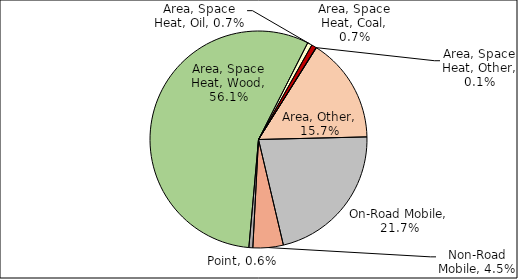
| Category | Series 0 |
|---|---|
| Point | 0.006 |
| Area, Space Heat, Wood | 0.561 |
| Area, Space Heat, Oil | 0.007 |
| Area, Space Heat, Coal | 0.007 |
| Area, Space Heat, Other | 0.001 |
| Area, Other | 0.157 |
| On-Road Mobile | 0.217 |
| Non-Road Mobile | 0.045 |